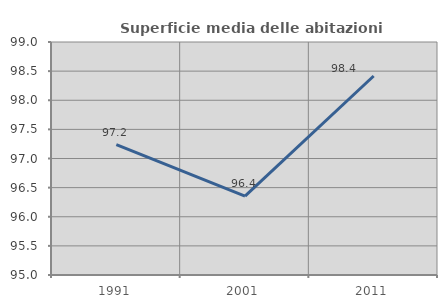
| Category | Superficie media delle abitazioni occupate |
|---|---|
| 1991.0 | 97.239 |
| 2001.0 | 96.355 |
| 2011.0 | 98.416 |